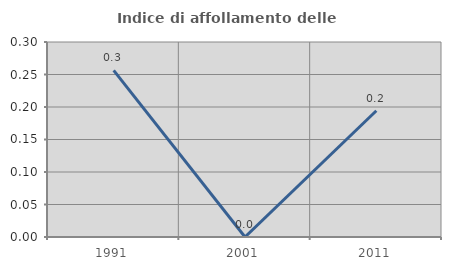
| Category | Indice di affollamento delle abitazioni  |
|---|---|
| 1991.0 | 0.256 |
| 2001.0 | 0 |
| 2011.0 | 0.194 |